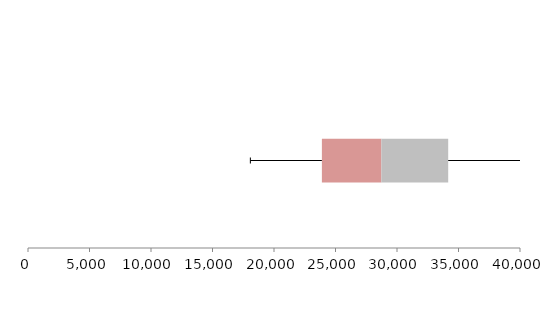
| Category | Series 1 | Series 2 | Series 3 |
|---|---|---|---|
| 0 | 23893.333 | 4835.168 | 5433.788 |